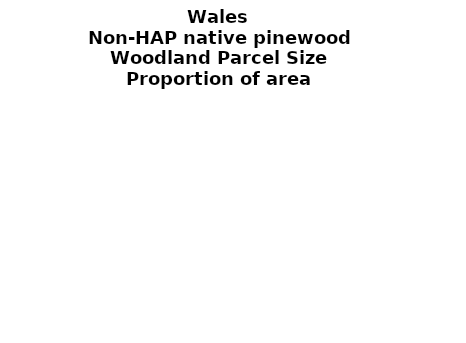
| Category | Non-HAP native pinewood |
|---|---|
| <5 ha | 0 |
| ≥5 and <10 ha | 0 |
| ≥10 and <15 ha | 0 |
| ≥15 and <20 ha | 0 |
| ≥20 and <25 ha | 0 |
| ≥25 and <30 ha | 0 |
| ≥30 and <35 ha | 0 |
| ≥35 and <40 ha | 0 |
| ≥40 and <45 ha | 0 |
| ≥45 and <50 ha | 0 |
| ≥50 and <60 ha | 0 |
| ≥60 and <70 ha | 0 |
| ≥70 and <80 ha | 0 |
| ≥80 and <90 ha | 0 |
| ≥90 and <100 ha | 0 |
| ≥100 and <150 ha | 0 |
| ≥150 and <200 ha | 0 |
| ≥200 ha | 0 |